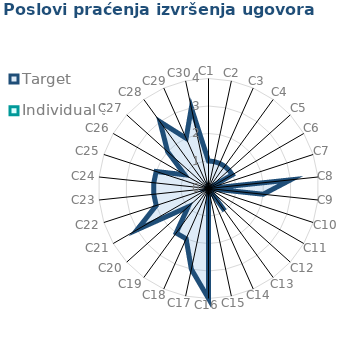
| Category | Target | Individual 3 |
|---|---|---|
| C1 | 1 | 0 |
| C2 | 1 | 0 |
| C3 | 1 | 0 |
| C4 | 1 | 0 |
| C5 | 1 | 0 |
| C6 | 1 | 0 |
| C7 | 0 | 0 |
| C8 | 3 | 0 |
| C9 | 2 | 0 |
| C10 | 0 | 0 |
| C11 | 0 | 0 |
| C12 | 0 | 0 |
| C13 | 1 | 0 |
| C14 | 0 | 0 |
| C15 | 0 | 0 |
| C16 | 4 | 0 |
| C17 | 3 | 0 |
| C18 | 2 | 0 |
| C19 | 2 | 0 |
| C20 | 1 | 0 |
| C21 | 3 | 0 |
| C22 | 2 | 0 |
| C23 | 2 | 0 |
| C24 | 2 | 0 |
| C25 | 2 | 0 |
| C26 | 1 | 0 |
| C27 | 2 | 0 |
| C28 | 3 | 0 |
| C29 | 2 | 0 |
| C30 | 3 | 0 |